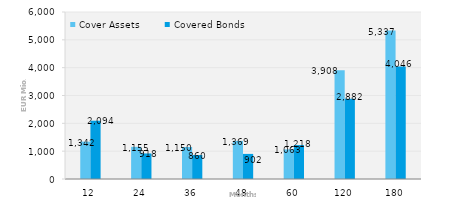
| Category | Cover Assets | Covered Bonds |
|---|---|---|
| 12.0 | 1342.446 | 2094 |
| 24.0 | 1154.758 | 917.7 |
| 36.0 | 1150.078 | 860.493 |
| 48.0 | 1368.892 | 901.8 |
| 60.0 | 1062.756 | 1218.404 |
| 120.0 | 3907.862 | 2882.24 |
| 180.0 | 5337.477 | 4046.156 |